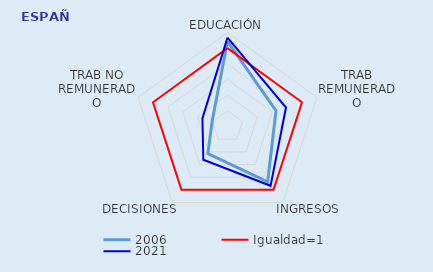
| Category | 2006 | Igualdad=1 | 2021 |
|---|---|---|---|
| EDUCACIÓN | 1.088 | 1 | 1.135 |
| TRAB REMUNERADO | 0.651 | 1 | 0.785 |
| INGRESOS | 0.872 | 1 | 0.936 |
| DECISIONES | 0.426 | 1 | 0.525 |
| TRAB NO REMUNERADO | 0.207 | 1 | 0.337 |